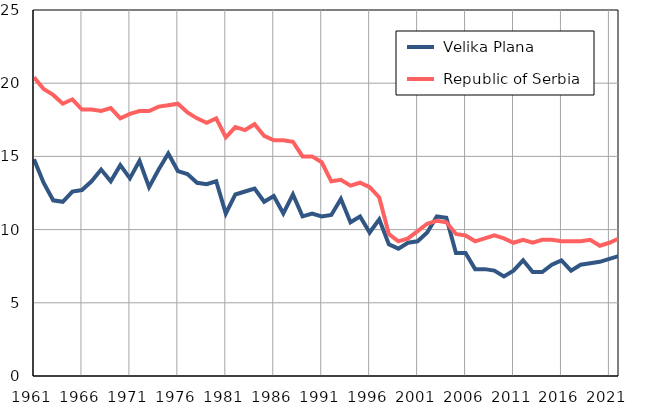
| Category |  Velika Plana |  Republic of Serbia |
|---|---|---|
| 1961.0 | 14.8 | 20.4 |
| 1962.0 | 13.2 | 19.6 |
| 1963.0 | 12 | 19.2 |
| 1964.0 | 11.9 | 18.6 |
| 1965.0 | 12.6 | 18.9 |
| 1966.0 | 12.7 | 18.2 |
| 1967.0 | 13.3 | 18.2 |
| 1968.0 | 14.1 | 18.1 |
| 1969.0 | 13.3 | 18.3 |
| 1970.0 | 14.4 | 17.6 |
| 1971.0 | 13.5 | 17.9 |
| 1972.0 | 14.7 | 18.1 |
| 1973.0 | 12.9 | 18.1 |
| 1974.0 | 14.1 | 18.4 |
| 1975.0 | 15.2 | 18.5 |
| 1976.0 | 14 | 18.6 |
| 1977.0 | 13.8 | 18 |
| 1978.0 | 13.2 | 17.6 |
| 1979.0 | 13.1 | 17.3 |
| 1980.0 | 13.3 | 17.6 |
| 1981.0 | 11.1 | 16.3 |
| 1982.0 | 12.4 | 17 |
| 1983.0 | 12.6 | 16.8 |
| 1984.0 | 12.8 | 17.2 |
| 1985.0 | 11.9 | 16.4 |
| 1986.0 | 12.3 | 16.1 |
| 1987.0 | 11.1 | 16.1 |
| 1988.0 | 12.4 | 16 |
| 1989.0 | 10.9 | 15 |
| 1990.0 | 11.1 | 15 |
| 1991.0 | 10.9 | 14.6 |
| 1992.0 | 11 | 13.3 |
| 1993.0 | 12.1 | 13.4 |
| 1994.0 | 10.5 | 13 |
| 1995.0 | 10.9 | 13.2 |
| 1996.0 | 9.8 | 12.9 |
| 1997.0 | 10.7 | 12.2 |
| 1998.0 | 9 | 9.7 |
| 1999.0 | 8.7 | 9.2 |
| 2000.0 | 9.1 | 9.4 |
| 2001.0 | 9.2 | 9.9 |
| 2002.0 | 9.8 | 10.4 |
| 2003.0 | 10.9 | 10.6 |
| 2004.0 | 10.8 | 10.5 |
| 2005.0 | 8.4 | 9.7 |
| 2006.0 | 8.4 | 9.6 |
| 2007.0 | 7.3 | 9.2 |
| 2008.0 | 7.3 | 9.4 |
| 2009.0 | 7.2 | 9.6 |
| 2010.0 | 6.8 | 9.4 |
| 2011.0 | 7.2 | 9.1 |
| 2012.0 | 7.9 | 9.3 |
| 2013.0 | 7.1 | 9.1 |
| 2014.0 | 7.1 | 9.3 |
| 2015.0 | 7.6 | 9.3 |
| 2016.0 | 7.9 | 9.2 |
| 2017.0 | 7.2 | 9.2 |
| 2018.0 | 7.6 | 9.2 |
| 2019.0 | 7.7 | 9.3 |
| 2020.0 | 7.8 | 8.9 |
| 2021.0 | 8 | 9.1 |
| 2022.0 | 8.2 | 9.4 |